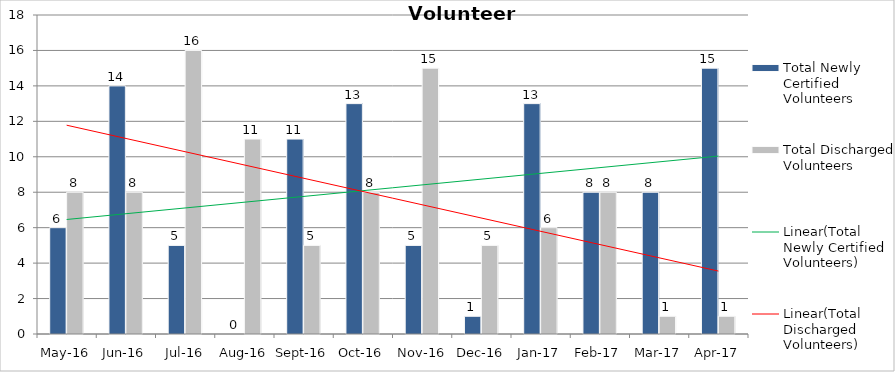
| Category | Total Newly Certified Volunteers | Total Discharged Volunteers |
|---|---|---|
| May-16 | 6 | 8 |
| Jun-16 | 14 | 8 |
| Jul-16 | 5 | 16 |
| Aug-16 | 0 | 11 |
| Sep-16 | 11 | 5 |
| Oct-16 | 13 | 8 |
| Nov-16 | 5 | 15 |
| Dec-16 | 1 | 5 |
| Jan-17 | 13 | 6 |
| Feb-17 | 8 | 8 |
| Mar-17 | 8 | 1 |
| Apr-17 | 15 | 1 |